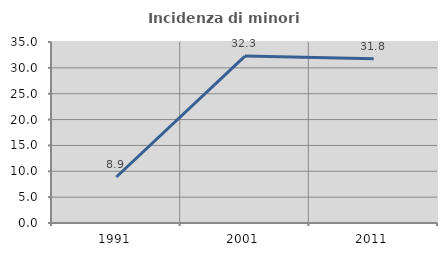
| Category | Incidenza di minori stranieri |
|---|---|
| 1991.0 | 8.889 |
| 2001.0 | 32.283 |
| 2011.0 | 31.759 |